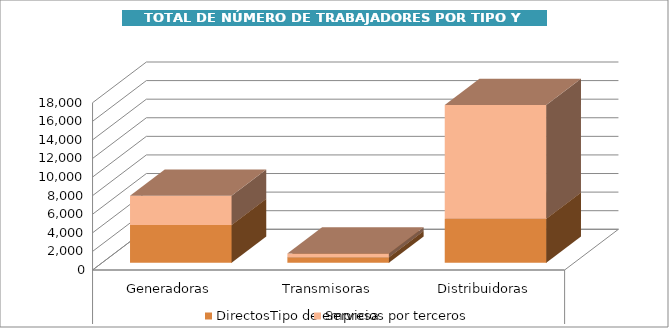
| Category | Directos | Servicios por terceros |
|---|---|---|
| 0 | 4055 | 3161 |
| 1 | 593 | 402 |
| 2 | 4737 | 12241 |